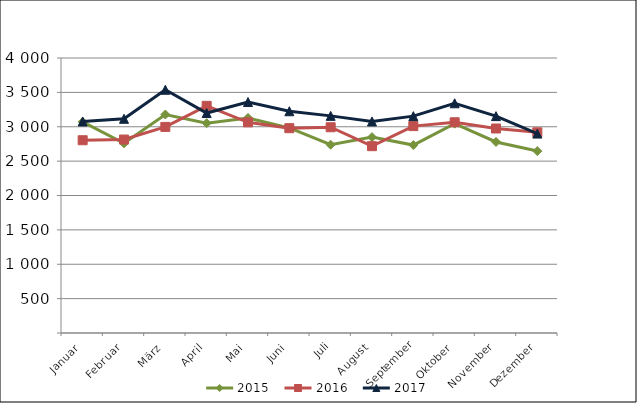
| Category | 2015 | 2016 | 2017 |
|---|---|---|---|
| Januar | 3072.064 | 2803.654 | 3076.863 |
| Februar | 2759.706 | 2813.982 | 3115.769 |
| März | 3177.937 | 2997.855 | 3537.961 |
| April | 3051.689 | 3304.19 | 3199.512 |
| Mai | 3128.043 | 3064.092 | 3359.494 |
| Juni | 2982.352 | 2979.239 | 3225.579 |
| Juli | 2738.818 | 2992.931 | 3158.224 |
| August | 2849.083 | 2717.355 | 3077.391 |
| September | 2733.484 | 3009.501 | 3154.469 |
| Oktober | 3044.904 | 3065.106 | 3341.49 |
| November | 2778.783 | 2974.577 | 3154.426 |
| Dezember | 2646.005 | 2919.295 | 2900.515 |